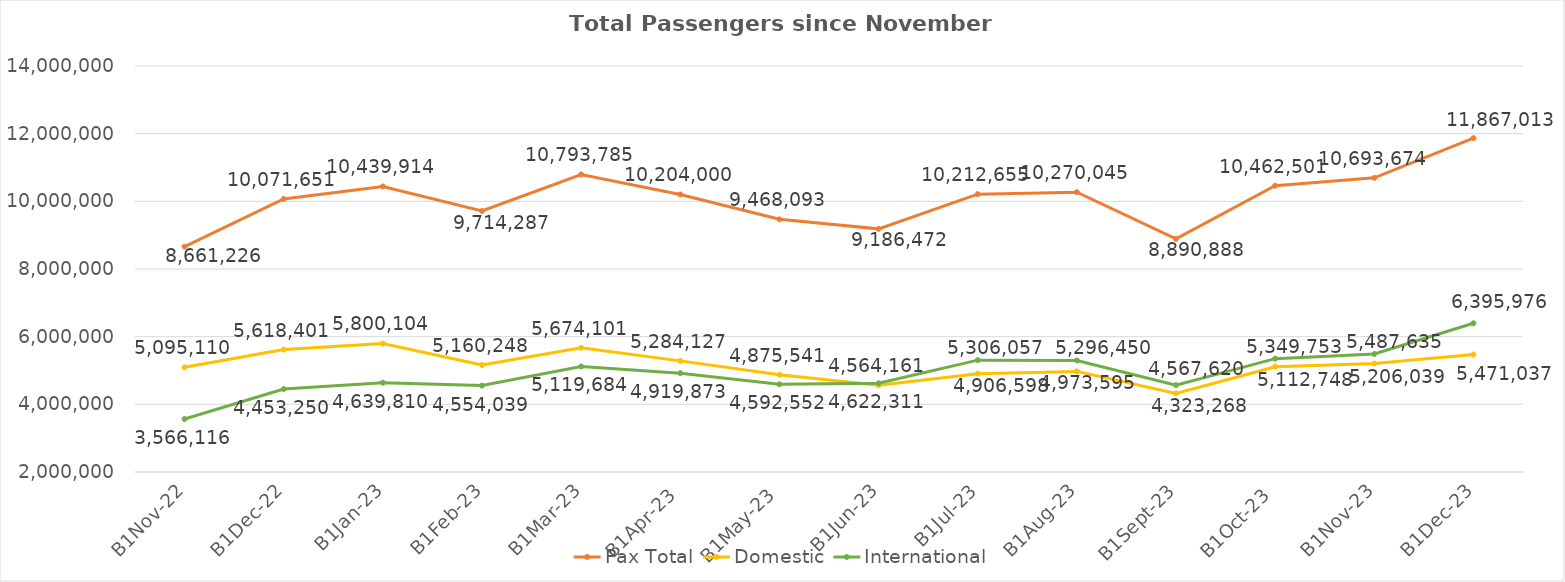
| Category | Pax Total | Domestic | International |
|---|---|---|---|
| 2022-11-01 | 8661226 | 5095110 | 3566116 |
| 2022-12-01 | 10071651 | 5618401 | 4453250 |
| 2023-01-01 | 10439914 | 5800104 | 4639810 |
| 2023-02-01 | 9714287 | 5160248 | 4554039 |
| 2023-03-01 | 10793785 | 5674101 | 5119684 |
| 2023-04-01 | 10204000 | 5284127 | 4919873 |
| 2023-05-01 | 9468093 | 4875541 | 4592552 |
| 2023-06-01 | 9186472 | 4564161 | 4622311 |
| 2023-07-01 | 10212655 | 4906598 | 5306057 |
| 2023-08-01 | 10270045 | 4973595 | 5296450 |
| 2023-09-01 | 8890888 | 4323268 | 4567620 |
| 2023-10-01 | 10462501 | 5112748 | 5349753 |
| 2023-11-01 | 10693674 | 5206039 | 5487635 |
| 2023-12-01 | 11867013 | 5471037 | 6395976 |